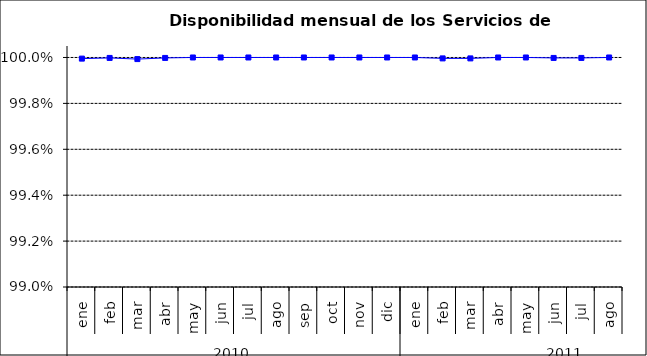
| Category | SCL * |
|---|---|
| 0 | 1 |
| 1 | 1 |
| 2 | 1 |
| 3 | 1 |
| 4 | 1 |
| 5 | 1 |
| 6 | 1 |
| 7 | 1 |
| 8 | 1 |
| 9 | 1 |
| 10 | 1 |
| 11 | 1 |
| 12 | 1 |
| 13 | 1 |
| 14 | 1 |
| 15 | 1 |
| 16 | 1 |
| 17 | 1 |
| 18 | 1 |
| 19 | 1 |